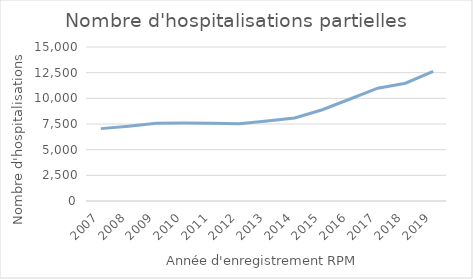
| Category | Nombre de séjours |
|---|---|
| 2007.0 | 7049 |
| 2008.0 | 7290 |
| 2009.0 | 7573 |
| 2010.0 | 7589 |
| 2011.0 | 7581 |
| 2012.0 | 7531 |
| 2013.0 | 7802 |
| 2014.0 | 8085 |
| 2015.0 | 8890 |
| 2016.0 | 9934 |
| 2017.0 | 10987 |
| 2018.0 | 11474 |
| 2019.0 | 12618 |